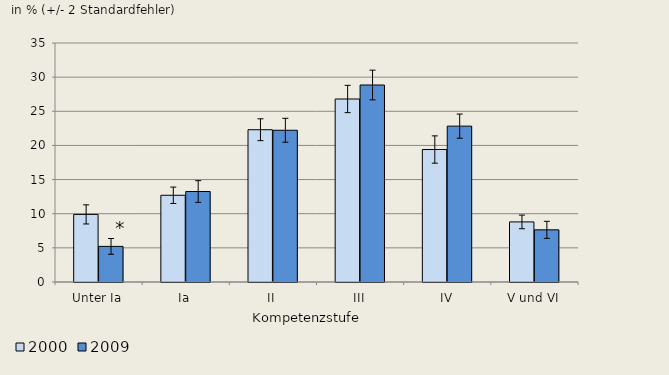
| Category | 2000 | 2009 |
|---|---|---|
| Unter Ia | 9.9 | 5.216 |
| Ia | 12.7 | 13.251 |
| II | 22.3 | 22.221 |
| III | 26.8 | 28.847 |
| IV | 19.4 | 22.826 |
| V und VI | 8.8 | 7.638 |